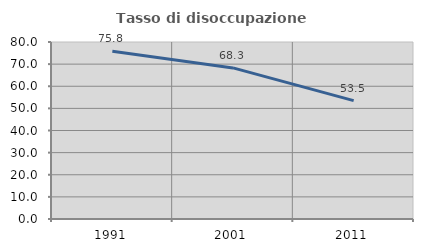
| Category | Tasso di disoccupazione giovanile  |
|---|---|
| 1991.0 | 75.817 |
| 2001.0 | 68.293 |
| 2011.0 | 53.488 |